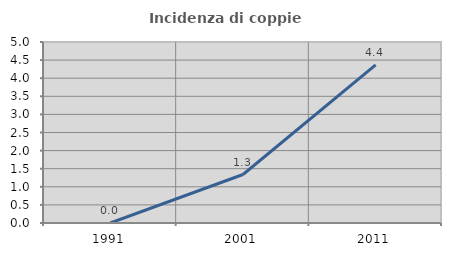
| Category | Incidenza di coppie miste |
|---|---|
| 1991.0 | 0 |
| 2001.0 | 1.339 |
| 2011.0 | 4.367 |